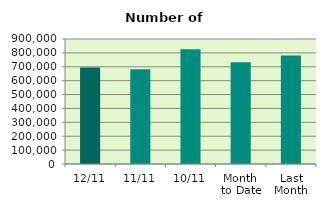
| Category | Series 0 |
|---|---|
| 12/11 | 694386 |
| 11/11 | 683072 |
| 10/11 | 826010 |
| Month 
to Date | 732392.8 |
| Last
Month | 780428.952 |